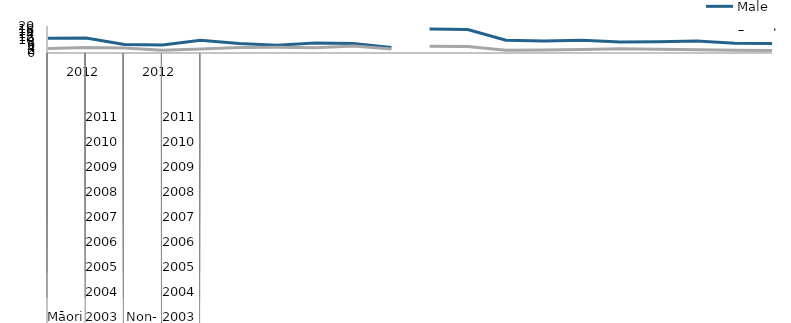
| Category | Male |
|---|---|
| 0 | 10.917 |
| 1 | 11.025 |
| 2 | 6.341 |
| 3 | 5.982 |
| 4 | 9.353 |
| 5 | 6.981 |
| 6 | 5.727 |
| 7 | 7.376 |
| 8 | 7.034 |
| 9 | 4.017 |
| 10 | 17.855 |
| 11 | 17.39 |
| 12 | 9.448 |
| 13 | 8.868 |
| 14 | 9.461 |
| 15 | 8.087 |
| 16 | 8.256 |
| 17 | 8.856 |
| 18 | 7.14 |
| 19 | 7.043 |